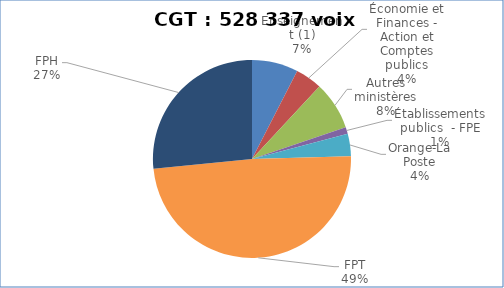
| Category | Nombre de voix |
|---|---|
| Enseignement (1) | 39877 |
| Économie et Finances - Action et Comptes publics | 23053.9 |
| Autres ministères | 41635.7 |
| Établissements publics  - FPE | 5853 |
| Orange-La Poste | 19388 |
| FPT | 258119 |
| FPH | 140410.5 |